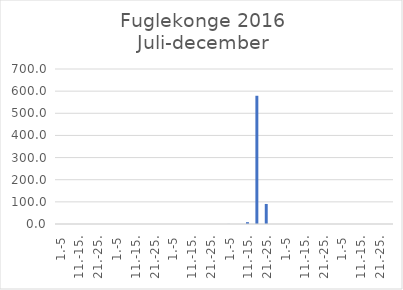
| Category | Series 0 |
|---|---|
| 1.-5 | 0 |
| 6.-10. | 0 |
| 11.-15. | 0 |
| 16.-20. | 0 |
| 21.-25. | 0 |
| 26.-31. | 0 |
| 1.-5 | 0 |
| 6.-10. | 0 |
| 11.-15. | 0 |
| 16.-20. | 0 |
| 21.-25. | 0 |
| 26.-31. | 0 |
| 1.-5 | 0 |
| 6.-10. | 0 |
| 11.-15. | 0 |
| 16.-20. | 0 |
| 21.-25. | 0 |
| 26.-30. | 0 |
| 1.-5 | 0.248 |
| 6.-10. | 0 |
| 11.-15. | 8.235 |
| 16.-20. | 579.126 |
| 21.-25. | 90.487 |
| 26.-31. | 0 |
| 1.-5 | 0 |
| 6.-10. | 0 |
| 11.-15. | 0 |
| 16.-20. | 0 |
| 21.-25. | 0 |
| 26.-30. | 0 |
| 1.-5 | 0 |
| 6.-10. | 0 |
| 11.-15. | 0 |
| 16.-20. | 0 |
| 21.-25. | 0 |
| 26.-31. | 0 |